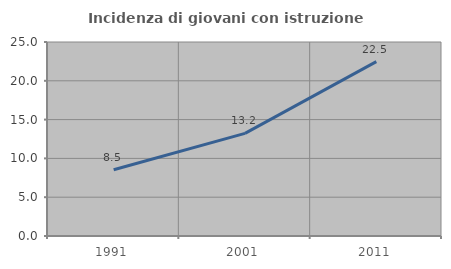
| Category | Incidenza di giovani con istruzione universitaria |
|---|---|
| 1991.0 | 8.546 |
| 2001.0 | 13.23 |
| 2011.0 | 22.471 |